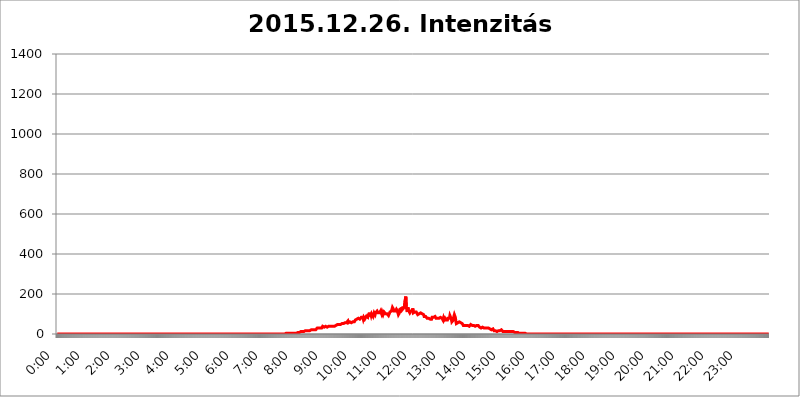
| Category | 2015.12.26. Intenzitás [W/m^2] |
|---|---|
| 0.0 | 0 |
| 0.0006944444444444445 | 0 |
| 0.001388888888888889 | 0 |
| 0.0020833333333333333 | 0 |
| 0.002777777777777778 | 0 |
| 0.003472222222222222 | 0 |
| 0.004166666666666667 | 0 |
| 0.004861111111111111 | 0 |
| 0.005555555555555556 | 0 |
| 0.0062499999999999995 | 0 |
| 0.006944444444444444 | 0 |
| 0.007638888888888889 | 0 |
| 0.008333333333333333 | 0 |
| 0.009027777777777779 | 0 |
| 0.009722222222222222 | 0 |
| 0.010416666666666666 | 0 |
| 0.011111111111111112 | 0 |
| 0.011805555555555555 | 0 |
| 0.012499999999999999 | 0 |
| 0.013194444444444444 | 0 |
| 0.013888888888888888 | 0 |
| 0.014583333333333332 | 0 |
| 0.015277777777777777 | 0 |
| 0.015972222222222224 | 0 |
| 0.016666666666666666 | 0 |
| 0.017361111111111112 | 0 |
| 0.018055555555555557 | 0 |
| 0.01875 | 0 |
| 0.019444444444444445 | 0 |
| 0.02013888888888889 | 0 |
| 0.020833333333333332 | 0 |
| 0.02152777777777778 | 0 |
| 0.022222222222222223 | 0 |
| 0.02291666666666667 | 0 |
| 0.02361111111111111 | 0 |
| 0.024305555555555556 | 0 |
| 0.024999999999999998 | 0 |
| 0.025694444444444447 | 0 |
| 0.02638888888888889 | 0 |
| 0.027083333333333334 | 0 |
| 0.027777777777777776 | 0 |
| 0.02847222222222222 | 0 |
| 0.029166666666666664 | 0 |
| 0.029861111111111113 | 0 |
| 0.030555555555555555 | 0 |
| 0.03125 | 0 |
| 0.03194444444444445 | 0 |
| 0.03263888888888889 | 0 |
| 0.03333333333333333 | 0 |
| 0.034027777777777775 | 0 |
| 0.034722222222222224 | 0 |
| 0.035416666666666666 | 0 |
| 0.036111111111111115 | 0 |
| 0.03680555555555556 | 0 |
| 0.0375 | 0 |
| 0.03819444444444444 | 0 |
| 0.03888888888888889 | 0 |
| 0.03958333333333333 | 0 |
| 0.04027777777777778 | 0 |
| 0.04097222222222222 | 0 |
| 0.041666666666666664 | 0 |
| 0.042361111111111106 | 0 |
| 0.04305555555555556 | 0 |
| 0.043750000000000004 | 0 |
| 0.044444444444444446 | 0 |
| 0.04513888888888889 | 0 |
| 0.04583333333333334 | 0 |
| 0.04652777777777778 | 0 |
| 0.04722222222222222 | 0 |
| 0.04791666666666666 | 0 |
| 0.04861111111111111 | 0 |
| 0.049305555555555554 | 0 |
| 0.049999999999999996 | 0 |
| 0.05069444444444445 | 0 |
| 0.051388888888888894 | 0 |
| 0.052083333333333336 | 0 |
| 0.05277777777777778 | 0 |
| 0.05347222222222222 | 0 |
| 0.05416666666666667 | 0 |
| 0.05486111111111111 | 0 |
| 0.05555555555555555 | 0 |
| 0.05625 | 0 |
| 0.05694444444444444 | 0 |
| 0.057638888888888885 | 0 |
| 0.05833333333333333 | 0 |
| 0.05902777777777778 | 0 |
| 0.059722222222222225 | 0 |
| 0.06041666666666667 | 0 |
| 0.061111111111111116 | 0 |
| 0.06180555555555556 | 0 |
| 0.0625 | 0 |
| 0.06319444444444444 | 0 |
| 0.06388888888888888 | 0 |
| 0.06458333333333334 | 0 |
| 0.06527777777777778 | 0 |
| 0.06597222222222222 | 0 |
| 0.06666666666666667 | 0 |
| 0.06736111111111111 | 0 |
| 0.06805555555555555 | 0 |
| 0.06874999999999999 | 0 |
| 0.06944444444444443 | 0 |
| 0.07013888888888889 | 0 |
| 0.07083333333333333 | 0 |
| 0.07152777777777779 | 0 |
| 0.07222222222222223 | 0 |
| 0.07291666666666667 | 0 |
| 0.07361111111111111 | 0 |
| 0.07430555555555556 | 0 |
| 0.075 | 0 |
| 0.07569444444444444 | 0 |
| 0.0763888888888889 | 0 |
| 0.07708333333333334 | 0 |
| 0.07777777777777778 | 0 |
| 0.07847222222222222 | 0 |
| 0.07916666666666666 | 0 |
| 0.0798611111111111 | 0 |
| 0.08055555555555556 | 0 |
| 0.08125 | 0 |
| 0.08194444444444444 | 0 |
| 0.08263888888888889 | 0 |
| 0.08333333333333333 | 0 |
| 0.08402777777777777 | 0 |
| 0.08472222222222221 | 0 |
| 0.08541666666666665 | 0 |
| 0.08611111111111112 | 0 |
| 0.08680555555555557 | 0 |
| 0.08750000000000001 | 0 |
| 0.08819444444444445 | 0 |
| 0.08888888888888889 | 0 |
| 0.08958333333333333 | 0 |
| 0.09027777777777778 | 0 |
| 0.09097222222222222 | 0 |
| 0.09166666666666667 | 0 |
| 0.09236111111111112 | 0 |
| 0.09305555555555556 | 0 |
| 0.09375 | 0 |
| 0.09444444444444444 | 0 |
| 0.09513888888888888 | 0 |
| 0.09583333333333333 | 0 |
| 0.09652777777777777 | 0 |
| 0.09722222222222222 | 0 |
| 0.09791666666666667 | 0 |
| 0.09861111111111111 | 0 |
| 0.09930555555555555 | 0 |
| 0.09999999999999999 | 0 |
| 0.10069444444444443 | 0 |
| 0.1013888888888889 | 0 |
| 0.10208333333333335 | 0 |
| 0.10277777777777779 | 0 |
| 0.10347222222222223 | 0 |
| 0.10416666666666667 | 0 |
| 0.10486111111111111 | 0 |
| 0.10555555555555556 | 0 |
| 0.10625 | 0 |
| 0.10694444444444444 | 0 |
| 0.1076388888888889 | 0 |
| 0.10833333333333334 | 0 |
| 0.10902777777777778 | 0 |
| 0.10972222222222222 | 0 |
| 0.1111111111111111 | 0 |
| 0.11180555555555556 | 0 |
| 0.11180555555555556 | 0 |
| 0.1125 | 0 |
| 0.11319444444444444 | 0 |
| 0.11388888888888889 | 0 |
| 0.11458333333333333 | 0 |
| 0.11527777777777777 | 0 |
| 0.11597222222222221 | 0 |
| 0.11666666666666665 | 0 |
| 0.1173611111111111 | 0 |
| 0.11805555555555557 | 0 |
| 0.11944444444444445 | 0 |
| 0.12013888888888889 | 0 |
| 0.12083333333333333 | 0 |
| 0.12152777777777778 | 0 |
| 0.12222222222222223 | 0 |
| 0.12291666666666667 | 0 |
| 0.12291666666666667 | 0 |
| 0.12361111111111112 | 0 |
| 0.12430555555555556 | 0 |
| 0.125 | 0 |
| 0.12569444444444444 | 0 |
| 0.12638888888888888 | 0 |
| 0.12708333333333333 | 0 |
| 0.16875 | 0 |
| 0.12847222222222224 | 0 |
| 0.12916666666666668 | 0 |
| 0.12986111111111112 | 0 |
| 0.13055555555555556 | 0 |
| 0.13125 | 0 |
| 0.13194444444444445 | 0 |
| 0.1326388888888889 | 0 |
| 0.13333333333333333 | 0 |
| 0.13402777777777777 | 0 |
| 0.13402777777777777 | 0 |
| 0.13472222222222222 | 0 |
| 0.13541666666666666 | 0 |
| 0.1361111111111111 | 0 |
| 0.13749999999999998 | 0 |
| 0.13819444444444443 | 0 |
| 0.1388888888888889 | 0 |
| 0.13958333333333334 | 0 |
| 0.14027777777777778 | 0 |
| 0.14097222222222222 | 0 |
| 0.14166666666666666 | 0 |
| 0.1423611111111111 | 0 |
| 0.14305555555555557 | 0 |
| 0.14375000000000002 | 0 |
| 0.14444444444444446 | 0 |
| 0.1451388888888889 | 0 |
| 0.1451388888888889 | 0 |
| 0.14652777777777778 | 0 |
| 0.14722222222222223 | 0 |
| 0.14791666666666667 | 0 |
| 0.1486111111111111 | 0 |
| 0.14930555555555555 | 0 |
| 0.15 | 0 |
| 0.15069444444444444 | 0 |
| 0.15138888888888888 | 0 |
| 0.15208333333333332 | 0 |
| 0.15277777777777776 | 0 |
| 0.15347222222222223 | 0 |
| 0.15416666666666667 | 0 |
| 0.15486111111111112 | 0 |
| 0.15555555555555556 | 0 |
| 0.15625 | 0 |
| 0.15694444444444444 | 0 |
| 0.15763888888888888 | 0 |
| 0.15833333333333333 | 0 |
| 0.15902777777777777 | 0 |
| 0.15972222222222224 | 0 |
| 0.16041666666666668 | 0 |
| 0.16111111111111112 | 0 |
| 0.16180555555555556 | 0 |
| 0.1625 | 0 |
| 0.16319444444444445 | 0 |
| 0.1638888888888889 | 0 |
| 0.16458333333333333 | 0 |
| 0.16527777777777777 | 0 |
| 0.16597222222222222 | 0 |
| 0.16666666666666666 | 0 |
| 0.1673611111111111 | 0 |
| 0.16805555555555554 | 0 |
| 0.16874999999999998 | 0 |
| 0.16944444444444443 | 0 |
| 0.17013888888888887 | 0 |
| 0.1708333333333333 | 0 |
| 0.17152777777777775 | 0 |
| 0.17222222222222225 | 0 |
| 0.1729166666666667 | 0 |
| 0.17361111111111113 | 0 |
| 0.17430555555555557 | 0 |
| 0.17500000000000002 | 0 |
| 0.17569444444444446 | 0 |
| 0.1763888888888889 | 0 |
| 0.17708333333333334 | 0 |
| 0.17777777777777778 | 0 |
| 0.17847222222222223 | 0 |
| 0.17916666666666667 | 0 |
| 0.1798611111111111 | 0 |
| 0.18055555555555555 | 0 |
| 0.18125 | 0 |
| 0.18194444444444444 | 0 |
| 0.1826388888888889 | 0 |
| 0.18333333333333335 | 0 |
| 0.1840277777777778 | 0 |
| 0.18472222222222223 | 0 |
| 0.18541666666666667 | 0 |
| 0.18611111111111112 | 0 |
| 0.18680555555555556 | 0 |
| 0.1875 | 0 |
| 0.18819444444444444 | 0 |
| 0.18888888888888888 | 0 |
| 0.18958333333333333 | 0 |
| 0.19027777777777777 | 0 |
| 0.1909722222222222 | 0 |
| 0.19166666666666665 | 0 |
| 0.19236111111111112 | 0 |
| 0.19305555555555554 | 0 |
| 0.19375 | 0 |
| 0.19444444444444445 | 0 |
| 0.1951388888888889 | 0 |
| 0.19583333333333333 | 0 |
| 0.19652777777777777 | 0 |
| 0.19722222222222222 | 0 |
| 0.19791666666666666 | 0 |
| 0.1986111111111111 | 0 |
| 0.19930555555555554 | 0 |
| 0.19999999999999998 | 0 |
| 0.20069444444444443 | 0 |
| 0.20138888888888887 | 0 |
| 0.2020833333333333 | 0 |
| 0.2027777777777778 | 0 |
| 0.2034722222222222 | 0 |
| 0.2041666666666667 | 0 |
| 0.20486111111111113 | 0 |
| 0.20555555555555557 | 0 |
| 0.20625000000000002 | 0 |
| 0.20694444444444446 | 0 |
| 0.2076388888888889 | 0 |
| 0.20833333333333334 | 0 |
| 0.20902777777777778 | 0 |
| 0.20972222222222223 | 0 |
| 0.21041666666666667 | 0 |
| 0.2111111111111111 | 0 |
| 0.21180555555555555 | 0 |
| 0.2125 | 0 |
| 0.21319444444444444 | 0 |
| 0.2138888888888889 | 0 |
| 0.21458333333333335 | 0 |
| 0.2152777777777778 | 0 |
| 0.21597222222222223 | 0 |
| 0.21666666666666667 | 0 |
| 0.21736111111111112 | 0 |
| 0.21805555555555556 | 0 |
| 0.21875 | 0 |
| 0.21944444444444444 | 0 |
| 0.22013888888888888 | 0 |
| 0.22083333333333333 | 0 |
| 0.22152777777777777 | 0 |
| 0.2222222222222222 | 0 |
| 0.22291666666666665 | 0 |
| 0.2236111111111111 | 0 |
| 0.22430555555555556 | 0 |
| 0.225 | 0 |
| 0.22569444444444445 | 0 |
| 0.2263888888888889 | 0 |
| 0.22708333333333333 | 0 |
| 0.22777777777777777 | 0 |
| 0.22847222222222222 | 0 |
| 0.22916666666666666 | 0 |
| 0.2298611111111111 | 0 |
| 0.23055555555555554 | 0 |
| 0.23124999999999998 | 0 |
| 0.23194444444444443 | 0 |
| 0.23263888888888887 | 0 |
| 0.2333333333333333 | 0 |
| 0.2340277777777778 | 0 |
| 0.2347222222222222 | 0 |
| 0.2354166666666667 | 0 |
| 0.23611111111111113 | 0 |
| 0.23680555555555557 | 0 |
| 0.23750000000000002 | 0 |
| 0.23819444444444446 | 0 |
| 0.2388888888888889 | 0 |
| 0.23958333333333334 | 0 |
| 0.24027777777777778 | 0 |
| 0.24097222222222223 | 0 |
| 0.24166666666666667 | 0 |
| 0.2423611111111111 | 0 |
| 0.24305555555555555 | 0 |
| 0.24375 | 0 |
| 0.24444444444444446 | 0 |
| 0.24513888888888888 | 0 |
| 0.24583333333333335 | 0 |
| 0.2465277777777778 | 0 |
| 0.24722222222222223 | 0 |
| 0.24791666666666667 | 0 |
| 0.24861111111111112 | 0 |
| 0.24930555555555556 | 0 |
| 0.25 | 0 |
| 0.25069444444444444 | 0 |
| 0.2513888888888889 | 0 |
| 0.2520833333333333 | 0 |
| 0.25277777777777777 | 0 |
| 0.2534722222222222 | 0 |
| 0.25416666666666665 | 0 |
| 0.2548611111111111 | 0 |
| 0.2555555555555556 | 0 |
| 0.25625000000000003 | 0 |
| 0.2569444444444445 | 0 |
| 0.2576388888888889 | 0 |
| 0.25833333333333336 | 0 |
| 0.2590277777777778 | 0 |
| 0.25972222222222224 | 0 |
| 0.2604166666666667 | 0 |
| 0.2611111111111111 | 0 |
| 0.26180555555555557 | 0 |
| 0.2625 | 0 |
| 0.26319444444444445 | 0 |
| 0.2638888888888889 | 0 |
| 0.26458333333333334 | 0 |
| 0.2652777777777778 | 0 |
| 0.2659722222222222 | 0 |
| 0.26666666666666666 | 0 |
| 0.2673611111111111 | 0 |
| 0.26805555555555555 | 0 |
| 0.26875 | 0 |
| 0.26944444444444443 | 0 |
| 0.2701388888888889 | 0 |
| 0.2708333333333333 | 0 |
| 0.27152777777777776 | 0 |
| 0.2722222222222222 | 0 |
| 0.27291666666666664 | 0 |
| 0.2736111111111111 | 0 |
| 0.2743055555555555 | 0 |
| 0.27499999999999997 | 0 |
| 0.27569444444444446 | 0 |
| 0.27638888888888885 | 0 |
| 0.27708333333333335 | 0 |
| 0.2777777777777778 | 0 |
| 0.27847222222222223 | 0 |
| 0.2791666666666667 | 0 |
| 0.2798611111111111 | 0 |
| 0.28055555555555556 | 0 |
| 0.28125 | 0 |
| 0.28194444444444444 | 0 |
| 0.2826388888888889 | 0 |
| 0.2833333333333333 | 0 |
| 0.28402777777777777 | 0 |
| 0.2847222222222222 | 0 |
| 0.28541666666666665 | 0 |
| 0.28611111111111115 | 0 |
| 0.28680555555555554 | 0 |
| 0.28750000000000003 | 0 |
| 0.2881944444444445 | 0 |
| 0.2888888888888889 | 0 |
| 0.28958333333333336 | 0 |
| 0.2902777777777778 | 0 |
| 0.29097222222222224 | 0 |
| 0.2916666666666667 | 0 |
| 0.2923611111111111 | 0 |
| 0.29305555555555557 | 0 |
| 0.29375 | 0 |
| 0.29444444444444445 | 0 |
| 0.2951388888888889 | 0 |
| 0.29583333333333334 | 0 |
| 0.2965277777777778 | 0 |
| 0.2972222222222222 | 0 |
| 0.29791666666666666 | 0 |
| 0.2986111111111111 | 0 |
| 0.29930555555555555 | 0 |
| 0.3 | 0 |
| 0.30069444444444443 | 0 |
| 0.3013888888888889 | 0 |
| 0.3020833333333333 | 0 |
| 0.30277777777777776 | 0 |
| 0.3034722222222222 | 0 |
| 0.30416666666666664 | 0 |
| 0.3048611111111111 | 0 |
| 0.3055555555555555 | 0 |
| 0.30624999999999997 | 0 |
| 0.3069444444444444 | 0 |
| 0.3076388888888889 | 0 |
| 0.30833333333333335 | 0 |
| 0.3090277777777778 | 0 |
| 0.30972222222222223 | 0 |
| 0.3104166666666667 | 0 |
| 0.3111111111111111 | 0 |
| 0.31180555555555556 | 0 |
| 0.3125 | 0 |
| 0.31319444444444444 | 0 |
| 0.3138888888888889 | 0 |
| 0.3145833333333333 | 0 |
| 0.31527777777777777 | 0 |
| 0.3159722222222222 | 0 |
| 0.31666666666666665 | 0 |
| 0.31736111111111115 | 0 |
| 0.31805555555555554 | 0 |
| 0.31875000000000003 | 0 |
| 0.3194444444444445 | 0 |
| 0.3201388888888889 | 0 |
| 0.32083333333333336 | 3.525 |
| 0.3215277777777778 | 0 |
| 0.32222222222222224 | 0 |
| 0.3229166666666667 | 3.525 |
| 0.3236111111111111 | 3.525 |
| 0.32430555555555557 | 3.525 |
| 0.325 | 3.525 |
| 0.32569444444444445 | 3.525 |
| 0.3263888888888889 | 3.525 |
| 0.32708333333333334 | 3.525 |
| 0.3277777777777778 | 3.525 |
| 0.3284722222222222 | 3.525 |
| 0.32916666666666666 | 3.525 |
| 0.3298611111111111 | 3.525 |
| 0.33055555555555555 | 3.525 |
| 0.33125 | 3.525 |
| 0.33194444444444443 | 3.525 |
| 0.3326388888888889 | 3.525 |
| 0.3333333333333333 | 3.525 |
| 0.3340277777777778 | 3.525 |
| 0.3347222222222222 | 3.525 |
| 0.3354166666666667 | 3.525 |
| 0.3361111111111111 | 3.525 |
| 0.3368055555555556 | 7.887 |
| 0.33749999999999997 | 7.887 |
| 0.33819444444444446 | 7.887 |
| 0.33888888888888885 | 7.887 |
| 0.33958333333333335 | 7.887 |
| 0.34027777777777773 | 7.887 |
| 0.34097222222222223 | 12.257 |
| 0.3416666666666666 | 12.257 |
| 0.3423611111111111 | 12.257 |
| 0.3430555555555555 | 12.257 |
| 0.34375 | 12.257 |
| 0.3444444444444445 | 12.257 |
| 0.3451388888888889 | 12.257 |
| 0.3458333333333334 | 12.257 |
| 0.34652777777777777 | 16.636 |
| 0.34722222222222227 | 16.636 |
| 0.34791666666666665 | 16.636 |
| 0.34861111111111115 | 12.257 |
| 0.34930555555555554 | 16.636 |
| 0.35000000000000003 | 16.636 |
| 0.3506944444444444 | 16.636 |
| 0.3513888888888889 | 16.636 |
| 0.3520833333333333 | 16.636 |
| 0.3527777777777778 | 16.636 |
| 0.3534722222222222 | 16.636 |
| 0.3541666666666667 | 16.636 |
| 0.3548611111111111 | 16.636 |
| 0.35555555555555557 | 21.024 |
| 0.35625 | 21.024 |
| 0.35694444444444445 | 21.024 |
| 0.3576388888888889 | 21.024 |
| 0.35833333333333334 | 21.024 |
| 0.3590277777777778 | 21.024 |
| 0.3597222222222222 | 21.024 |
| 0.36041666666666666 | 21.024 |
| 0.3611111111111111 | 21.024 |
| 0.36180555555555555 | 21.024 |
| 0.3625 | 21.024 |
| 0.36319444444444443 | 25.419 |
| 0.3638888888888889 | 25.419 |
| 0.3645833333333333 | 29.823 |
| 0.3652777777777778 | 29.823 |
| 0.3659722222222222 | 29.823 |
| 0.3666666666666667 | 29.823 |
| 0.3673611111111111 | 29.823 |
| 0.3680555555555556 | 29.823 |
| 0.36874999999999997 | 29.823 |
| 0.36944444444444446 | 29.823 |
| 0.37013888888888885 | 34.234 |
| 0.37083333333333335 | 29.823 |
| 0.37152777777777773 | 34.234 |
| 0.37222222222222223 | 38.653 |
| 0.3729166666666666 | 34.234 |
| 0.3736111111111111 | 34.234 |
| 0.3743055555555555 | 34.234 |
| 0.375 | 34.234 |
| 0.3756944444444445 | 38.653 |
| 0.3763888888888889 | 38.653 |
| 0.3770833333333334 | 34.234 |
| 0.37777777777777777 | 34.234 |
| 0.37847222222222227 | 34.234 |
| 0.37916666666666665 | 34.234 |
| 0.37986111111111115 | 38.653 |
| 0.38055555555555554 | 38.653 |
| 0.38125000000000003 | 43.079 |
| 0.3819444444444444 | 38.653 |
| 0.3826388888888889 | 38.653 |
| 0.3833333333333333 | 38.653 |
| 0.3840277777777778 | 38.653 |
| 0.3847222222222222 | 38.653 |
| 0.3854166666666667 | 38.653 |
| 0.3861111111111111 | 38.653 |
| 0.38680555555555557 | 38.653 |
| 0.3875 | 38.653 |
| 0.38819444444444445 | 38.653 |
| 0.3888888888888889 | 38.653 |
| 0.38958333333333334 | 38.653 |
| 0.3902777777777778 | 38.653 |
| 0.3909722222222222 | 43.079 |
| 0.39166666666666666 | 43.079 |
| 0.3923611111111111 | 47.511 |
| 0.39305555555555555 | 47.511 |
| 0.39375 | 47.511 |
| 0.39444444444444443 | 47.511 |
| 0.3951388888888889 | 47.511 |
| 0.3958333333333333 | 47.511 |
| 0.3965277777777778 | 51.951 |
| 0.3972222222222222 | 47.511 |
| 0.3979166666666667 | 47.511 |
| 0.3986111111111111 | 51.951 |
| 0.3993055555555556 | 51.951 |
| 0.39999999999999997 | 47.511 |
| 0.40069444444444446 | 47.511 |
| 0.40138888888888885 | 51.951 |
| 0.40208333333333335 | 56.398 |
| 0.40277777777777773 | 56.398 |
| 0.40347222222222223 | 56.398 |
| 0.4041666666666666 | 56.398 |
| 0.4048611111111111 | 56.398 |
| 0.4055555555555555 | 56.398 |
| 0.40625 | 56.398 |
| 0.4069444444444445 | 51.951 |
| 0.4076388888888889 | 65.31 |
| 0.4083333333333334 | 56.398 |
| 0.40902777777777777 | 56.398 |
| 0.40972222222222227 | 56.398 |
| 0.41041666666666665 | 60.85 |
| 0.41111111111111115 | 56.398 |
| 0.41180555555555554 | 56.398 |
| 0.41250000000000003 | 56.398 |
| 0.4131944444444444 | 60.85 |
| 0.4138888888888889 | 60.85 |
| 0.4145833333333333 | 60.85 |
| 0.4152777777777778 | 60.85 |
| 0.4159722222222222 | 60.85 |
| 0.4166666666666667 | 60.85 |
| 0.4173611111111111 | 65.31 |
| 0.41805555555555557 | 69.775 |
| 0.41875 | 69.775 |
| 0.41944444444444445 | 74.246 |
| 0.4201388888888889 | 74.246 |
| 0.42083333333333334 | 74.246 |
| 0.4215277777777778 | 74.246 |
| 0.4222222222222222 | 78.722 |
| 0.42291666666666666 | 74.246 |
| 0.4236111111111111 | 78.722 |
| 0.42430555555555555 | 74.246 |
| 0.425 | 74.246 |
| 0.42569444444444443 | 78.722 |
| 0.4263888888888889 | 83.205 |
| 0.4270833333333333 | 83.205 |
| 0.4277777777777778 | 78.722 |
| 0.4284722222222222 | 83.205 |
| 0.4291666666666667 | 74.246 |
| 0.4298611111111111 | 83.205 |
| 0.4305555555555556 | 78.722 |
| 0.43124999999999997 | 74.246 |
| 0.43194444444444446 | 78.722 |
| 0.43263888888888885 | 78.722 |
| 0.43333333333333335 | 87.692 |
| 0.43402777777777773 | 83.205 |
| 0.43472222222222223 | 87.692 |
| 0.4354166666666666 | 83.205 |
| 0.4361111111111111 | 101.184 |
| 0.4368055555555555 | 87.692 |
| 0.4375 | 101.184 |
| 0.4381944444444445 | 101.184 |
| 0.4388888888888889 | 101.184 |
| 0.4395833333333334 | 101.184 |
| 0.44027777777777777 | 92.184 |
| 0.44097222222222227 | 101.184 |
| 0.44166666666666665 | 96.682 |
| 0.44236111111111115 | 92.184 |
| 0.44305555555555554 | 105.69 |
| 0.44375000000000003 | 96.682 |
| 0.4444444444444444 | 105.69 |
| 0.4451388888888889 | 101.184 |
| 0.4458333333333333 | 96.682 |
| 0.4465277777777778 | 105.69 |
| 0.4472222222222222 | 101.184 |
| 0.4479166666666667 | 110.201 |
| 0.4486111111111111 | 114.716 |
| 0.44930555555555557 | 110.201 |
| 0.45 | 105.69 |
| 0.45069444444444445 | 110.201 |
| 0.4513888888888889 | 105.69 |
| 0.45208333333333334 | 105.69 |
| 0.4527777777777778 | 101.184 |
| 0.4534722222222222 | 114.716 |
| 0.45416666666666666 | 110.201 |
| 0.4548611111111111 | 101.184 |
| 0.45555555555555555 | 110.201 |
| 0.45625 | 105.69 |
| 0.45694444444444443 | 96.682 |
| 0.4576388888888889 | 101.184 |
| 0.4583333333333333 | 110.201 |
| 0.4590277777777778 | 110.201 |
| 0.4597222222222222 | 110.201 |
| 0.4604166666666667 | 101.184 |
| 0.4611111111111111 | 96.682 |
| 0.4618055555555556 | 96.682 |
| 0.46249999999999997 | 101.184 |
| 0.46319444444444446 | 101.184 |
| 0.46388888888888885 | 96.682 |
| 0.46458333333333335 | 92.184 |
| 0.46527777777777773 | 92.184 |
| 0.46597222222222223 | 96.682 |
| 0.4666666666666666 | 110.201 |
| 0.4673611111111111 | 110.201 |
| 0.4680555555555555 | 114.716 |
| 0.46875 | 114.716 |
| 0.4694444444444445 | 119.235 |
| 0.4701388888888889 | 132.814 |
| 0.4708333333333334 | 132.814 |
| 0.47152777777777777 | 123.758 |
| 0.47222222222222227 | 114.716 |
| 0.47291666666666665 | 110.201 |
| 0.47361111111111115 | 110.201 |
| 0.47430555555555554 | 114.716 |
| 0.47500000000000003 | 114.716 |
| 0.4756944444444444 | 123.758 |
| 0.4763888888888889 | 119.235 |
| 0.4770833333333333 | 114.716 |
| 0.4777777777777778 | 105.69 |
| 0.4784722222222222 | 96.682 |
| 0.4791666666666667 | 101.184 |
| 0.4798611111111111 | 105.69 |
| 0.48055555555555557 | 123.758 |
| 0.48125 | 119.235 |
| 0.48194444444444445 | 119.235 |
| 0.4826388888888889 | 128.284 |
| 0.48333333333333334 | 119.235 |
| 0.4840277777777778 | 123.758 |
| 0.4847222222222222 | 119.235 |
| 0.48541666666666666 | 128.284 |
| 0.4861111111111111 | 132.814 |
| 0.48680555555555555 | 137.347 |
| 0.4875 | 164.605 |
| 0.48819444444444443 | 173.709 |
| 0.4888888888888889 | 187.378 |
| 0.4895833333333333 | 137.347 |
| 0.4902777777777778 | 119.235 |
| 0.4909722222222222 | 110.201 |
| 0.4916666666666667 | 132.814 |
| 0.4923611111111111 | 123.758 |
| 0.4930555555555556 | 114.716 |
| 0.49374999999999997 | 110.201 |
| 0.49444444444444446 | 105.69 |
| 0.49513888888888885 | 105.69 |
| 0.49583333333333335 | 114.716 |
| 0.49652777777777773 | 119.235 |
| 0.49722222222222223 | 114.716 |
| 0.4979166666666666 | 114.716 |
| 0.4986111111111111 | 128.284 |
| 0.4993055555555555 | 105.69 |
| 0.5 | 110.201 |
| 0.5006944444444444 | 110.201 |
| 0.5013888888888889 | 110.201 |
| 0.5020833333333333 | 114.716 |
| 0.5027777777777778 | 114.716 |
| 0.5034722222222222 | 110.201 |
| 0.5041666666666667 | 110.201 |
| 0.5048611111111111 | 105.69 |
| 0.5055555555555555 | 96.682 |
| 0.50625 | 96.682 |
| 0.5069444444444444 | 101.184 |
| 0.5076388888888889 | 101.184 |
| 0.5083333333333333 | 105.69 |
| 0.5090277777777777 | 105.69 |
| 0.5097222222222222 | 105.69 |
| 0.5104166666666666 | 110.201 |
| 0.5111111111111112 | 110.201 |
| 0.5118055555555555 | 101.184 |
| 0.5125000000000001 | 101.184 |
| 0.5131944444444444 | 101.184 |
| 0.513888888888889 | 96.682 |
| 0.5145833333333333 | 87.692 |
| 0.5152777777777778 | 83.205 |
| 0.5159722222222222 | 87.692 |
| 0.5166666666666667 | 87.692 |
| 0.517361111111111 | 87.692 |
| 0.5180555555555556 | 83.205 |
| 0.5187499999999999 | 78.722 |
| 0.5194444444444445 | 74.246 |
| 0.5201388888888888 | 83.205 |
| 0.5208333333333334 | 78.722 |
| 0.5215277777777778 | 78.722 |
| 0.5222222222222223 | 78.722 |
| 0.5229166666666667 | 74.246 |
| 0.5236111111111111 | 74.246 |
| 0.5243055555555556 | 69.775 |
| 0.525 | 74.246 |
| 0.5256944444444445 | 83.205 |
| 0.5263888888888889 | 83.205 |
| 0.5270833333333333 | 83.205 |
| 0.5277777777777778 | 83.205 |
| 0.5284722222222222 | 87.692 |
| 0.5291666666666667 | 87.692 |
| 0.5298611111111111 | 87.692 |
| 0.5305555555555556 | 87.692 |
| 0.53125 | 78.722 |
| 0.5319444444444444 | 74.246 |
| 0.5326388888888889 | 74.246 |
| 0.5333333333333333 | 78.722 |
| 0.5340277777777778 | 78.722 |
| 0.5347222222222222 | 74.246 |
| 0.5354166666666667 | 78.722 |
| 0.5361111111111111 | 83.205 |
| 0.5368055555555555 | 83.205 |
| 0.5375 | 83.205 |
| 0.5381944444444444 | 87.692 |
| 0.5388888888888889 | 87.692 |
| 0.5395833333333333 | 78.722 |
| 0.5402777777777777 | 74.246 |
| 0.5409722222222222 | 69.775 |
| 0.5416666666666666 | 78.722 |
| 0.5423611111111112 | 69.775 |
| 0.5430555555555555 | 74.246 |
| 0.5437500000000001 | 78.722 |
| 0.5444444444444444 | 74.246 |
| 0.545138888888889 | 69.775 |
| 0.5458333333333333 | 69.775 |
| 0.5465277777777778 | 65.31 |
| 0.5472222222222222 | 69.775 |
| 0.5479166666666667 | 78.722 |
| 0.548611111111111 | 83.205 |
| 0.5493055555555556 | 74.246 |
| 0.5499999999999999 | 78.722 |
| 0.5506944444444445 | 92.184 |
| 0.5513888888888888 | 92.184 |
| 0.5520833333333334 | 87.692 |
| 0.5527777777777778 | 74.246 |
| 0.5534722222222223 | 60.85 |
| 0.5541666666666667 | 56.398 |
| 0.5548611111111111 | 56.398 |
| 0.5555555555555556 | 69.775 |
| 0.55625 | 87.692 |
| 0.5569444444444445 | 96.682 |
| 0.5576388888888889 | 96.682 |
| 0.5583333333333333 | 83.205 |
| 0.5590277777777778 | 65.31 |
| 0.5597222222222222 | 51.951 |
| 0.5604166666666667 | 47.511 |
| 0.5611111111111111 | 56.398 |
| 0.5618055555555556 | 56.398 |
| 0.5625 | 56.398 |
| 0.5631944444444444 | 60.85 |
| 0.5638888888888889 | 60.85 |
| 0.5645833333333333 | 56.398 |
| 0.5652777777777778 | 60.85 |
| 0.5659722222222222 | 56.398 |
| 0.5666666666666667 | 51.951 |
| 0.5673611111111111 | 51.951 |
| 0.5680555555555555 | 51.951 |
| 0.56875 | 47.511 |
| 0.5694444444444444 | 43.079 |
| 0.5701388888888889 | 43.079 |
| 0.5708333333333333 | 43.079 |
| 0.5715277777777777 | 43.079 |
| 0.5722222222222222 | 43.079 |
| 0.5729166666666666 | 43.079 |
| 0.5736111111111112 | 43.079 |
| 0.5743055555555555 | 43.079 |
| 0.5750000000000001 | 43.079 |
| 0.5756944444444444 | 43.079 |
| 0.576388888888889 | 43.079 |
| 0.5770833333333333 | 43.079 |
| 0.5777777777777778 | 38.653 |
| 0.5784722222222222 | 38.653 |
| 0.5791666666666667 | 43.079 |
| 0.579861111111111 | 47.511 |
| 0.5805555555555556 | 43.079 |
| 0.5812499999999999 | 43.079 |
| 0.5819444444444445 | 43.079 |
| 0.5826388888888888 | 43.079 |
| 0.5833333333333334 | 38.653 |
| 0.5840277777777778 | 43.079 |
| 0.5847222222222223 | 38.653 |
| 0.5854166666666667 | 38.653 |
| 0.5861111111111111 | 38.653 |
| 0.5868055555555556 | 43.079 |
| 0.5875 | 43.079 |
| 0.5881944444444445 | 43.079 |
| 0.5888888888888889 | 38.653 |
| 0.5895833333333333 | 38.653 |
| 0.5902777777777778 | 43.079 |
| 0.5909722222222222 | 47.511 |
| 0.5916666666666667 | 43.079 |
| 0.5923611111111111 | 34.234 |
| 0.5930555555555556 | 34.234 |
| 0.59375 | 29.823 |
| 0.5944444444444444 | 29.823 |
| 0.5951388888888889 | 29.823 |
| 0.5958333333333333 | 29.823 |
| 0.5965277777777778 | 34.234 |
| 0.5972222222222222 | 34.234 |
| 0.5979166666666667 | 34.234 |
| 0.5986111111111111 | 29.823 |
| 0.5993055555555555 | 29.823 |
| 0.6 | 29.823 |
| 0.6006944444444444 | 29.823 |
| 0.6013888888888889 | 25.419 |
| 0.6020833333333333 | 29.823 |
| 0.6027777777777777 | 29.823 |
| 0.6034722222222222 | 29.823 |
| 0.6041666666666666 | 29.823 |
| 0.6048611111111112 | 29.823 |
| 0.6055555555555555 | 29.823 |
| 0.6062500000000001 | 25.419 |
| 0.6069444444444444 | 25.419 |
| 0.607638888888889 | 25.419 |
| 0.6083333333333333 | 21.024 |
| 0.6090277777777778 | 21.024 |
| 0.6097222222222222 | 25.419 |
| 0.6104166666666667 | 25.419 |
| 0.611111111111111 | 25.419 |
| 0.6118055555555556 | 21.024 |
| 0.6124999999999999 | 16.636 |
| 0.6131944444444445 | 16.636 |
| 0.6138888888888888 | 16.636 |
| 0.6145833333333334 | 16.636 |
| 0.6152777777777778 | 12.257 |
| 0.6159722222222223 | 16.636 |
| 0.6166666666666667 | 12.257 |
| 0.6173611111111111 | 16.636 |
| 0.6180555555555556 | 16.636 |
| 0.61875 | 16.636 |
| 0.6194444444444445 | 16.636 |
| 0.6201388888888889 | 16.636 |
| 0.6208333333333333 | 16.636 |
| 0.6215277777777778 | 21.024 |
| 0.6222222222222222 | 21.024 |
| 0.6229166666666667 | 21.024 |
| 0.6236111111111111 | 16.636 |
| 0.6243055555555556 | 16.636 |
| 0.625 | 12.257 |
| 0.6256944444444444 | 12.257 |
| 0.6263888888888889 | 12.257 |
| 0.6270833333333333 | 12.257 |
| 0.6277777777777778 | 12.257 |
| 0.6284722222222222 | 7.887 |
| 0.6291666666666667 | 12.257 |
| 0.6298611111111111 | 12.257 |
| 0.6305555555555555 | 12.257 |
| 0.63125 | 12.257 |
| 0.6319444444444444 | 12.257 |
| 0.6326388888888889 | 12.257 |
| 0.6333333333333333 | 12.257 |
| 0.6340277777777777 | 7.887 |
| 0.6347222222222222 | 7.887 |
| 0.6354166666666666 | 12.257 |
| 0.6361111111111112 | 12.257 |
| 0.6368055555555555 | 7.887 |
| 0.6375000000000001 | 12.257 |
| 0.6381944444444444 | 12.257 |
| 0.638888888888889 | 12.257 |
| 0.6395833333333333 | 12.257 |
| 0.6402777777777778 | 12.257 |
| 0.6409722222222222 | 7.887 |
| 0.6416666666666667 | 7.887 |
| 0.642361111111111 | 7.887 |
| 0.6430555555555556 | 12.257 |
| 0.6437499999999999 | 7.887 |
| 0.6444444444444445 | 7.887 |
| 0.6451388888888888 | 7.887 |
| 0.6458333333333334 | 7.887 |
| 0.6465277777777778 | 7.887 |
| 0.6472222222222223 | 7.887 |
| 0.6479166666666667 | 3.525 |
| 0.6486111111111111 | 3.525 |
| 0.6493055555555556 | 3.525 |
| 0.65 | 3.525 |
| 0.6506944444444445 | 3.525 |
| 0.6513888888888889 | 3.525 |
| 0.6520833333333333 | 3.525 |
| 0.6527777777777778 | 3.525 |
| 0.6534722222222222 | 3.525 |
| 0.6541666666666667 | 3.525 |
| 0.6548611111111111 | 3.525 |
| 0.6555555555555556 | 3.525 |
| 0.65625 | 3.525 |
| 0.6569444444444444 | 0 |
| 0.6576388888888889 | 0 |
| 0.6583333333333333 | 0 |
| 0.6590277777777778 | 0 |
| 0.6597222222222222 | 0 |
| 0.6604166666666667 | 0 |
| 0.6611111111111111 | 0 |
| 0.6618055555555555 | 0 |
| 0.6625 | 0 |
| 0.6631944444444444 | 0 |
| 0.6638888888888889 | 0 |
| 0.6645833333333333 | 0 |
| 0.6652777777777777 | 0 |
| 0.6659722222222222 | 0 |
| 0.6666666666666666 | 0 |
| 0.6673611111111111 | 0 |
| 0.6680555555555556 | 0 |
| 0.6687500000000001 | 0 |
| 0.6694444444444444 | 0 |
| 0.6701388888888888 | 0 |
| 0.6708333333333334 | 0 |
| 0.6715277777777778 | 0 |
| 0.6722222222222222 | 0 |
| 0.6729166666666666 | 0 |
| 0.6736111111111112 | 0 |
| 0.6743055555555556 | 0 |
| 0.6749999999999999 | 0 |
| 0.6756944444444444 | 0 |
| 0.6763888888888889 | 0 |
| 0.6770833333333334 | 0 |
| 0.6777777777777777 | 0 |
| 0.6784722222222223 | 0 |
| 0.6791666666666667 | 0 |
| 0.6798611111111111 | 0 |
| 0.6805555555555555 | 0 |
| 0.68125 | 0 |
| 0.6819444444444445 | 0 |
| 0.6826388888888889 | 0 |
| 0.6833333333333332 | 0 |
| 0.6840277777777778 | 0 |
| 0.6847222222222222 | 0 |
| 0.6854166666666667 | 0 |
| 0.686111111111111 | 0 |
| 0.6868055555555556 | 0 |
| 0.6875 | 0 |
| 0.6881944444444444 | 0 |
| 0.688888888888889 | 0 |
| 0.6895833333333333 | 0 |
| 0.6902777777777778 | 0 |
| 0.6909722222222222 | 0 |
| 0.6916666666666668 | 0 |
| 0.6923611111111111 | 0 |
| 0.6930555555555555 | 0 |
| 0.69375 | 0 |
| 0.6944444444444445 | 0 |
| 0.6951388888888889 | 0 |
| 0.6958333333333333 | 0 |
| 0.6965277777777777 | 0 |
| 0.6972222222222223 | 0 |
| 0.6979166666666666 | 0 |
| 0.6986111111111111 | 0 |
| 0.6993055555555556 | 0 |
| 0.7000000000000001 | 0 |
| 0.7006944444444444 | 0 |
| 0.7013888888888888 | 0 |
| 0.7020833333333334 | 0 |
| 0.7027777777777778 | 0 |
| 0.7034722222222222 | 0 |
| 0.7041666666666666 | 0 |
| 0.7048611111111112 | 0 |
| 0.7055555555555556 | 0 |
| 0.7062499999999999 | 0 |
| 0.7069444444444444 | 0 |
| 0.7076388888888889 | 0 |
| 0.7083333333333334 | 0 |
| 0.7090277777777777 | 0 |
| 0.7097222222222223 | 0 |
| 0.7104166666666667 | 0 |
| 0.7111111111111111 | 0 |
| 0.7118055555555555 | 0 |
| 0.7125 | 0 |
| 0.7131944444444445 | 0 |
| 0.7138888888888889 | 0 |
| 0.7145833333333332 | 0 |
| 0.7152777777777778 | 0 |
| 0.7159722222222222 | 0 |
| 0.7166666666666667 | 0 |
| 0.717361111111111 | 0 |
| 0.7180555555555556 | 0 |
| 0.71875 | 0 |
| 0.7194444444444444 | 0 |
| 0.720138888888889 | 0 |
| 0.7208333333333333 | 0 |
| 0.7215277777777778 | 0 |
| 0.7222222222222222 | 0 |
| 0.7229166666666668 | 0 |
| 0.7236111111111111 | 0 |
| 0.7243055555555555 | 0 |
| 0.725 | 0 |
| 0.7256944444444445 | 0 |
| 0.7263888888888889 | 0 |
| 0.7270833333333333 | 0 |
| 0.7277777777777777 | 0 |
| 0.7284722222222223 | 0 |
| 0.7291666666666666 | 0 |
| 0.7298611111111111 | 0 |
| 0.7305555555555556 | 0 |
| 0.7312500000000001 | 0 |
| 0.7319444444444444 | 0 |
| 0.7326388888888888 | 0 |
| 0.7333333333333334 | 0 |
| 0.7340277777777778 | 0 |
| 0.7347222222222222 | 0 |
| 0.7354166666666666 | 0 |
| 0.7361111111111112 | 0 |
| 0.7368055555555556 | 0 |
| 0.7374999999999999 | 0 |
| 0.7381944444444444 | 0 |
| 0.7388888888888889 | 0 |
| 0.7395833333333334 | 0 |
| 0.7402777777777777 | 0 |
| 0.7409722222222223 | 0 |
| 0.7416666666666667 | 0 |
| 0.7423611111111111 | 0 |
| 0.7430555555555555 | 0 |
| 0.74375 | 0 |
| 0.7444444444444445 | 0 |
| 0.7451388888888889 | 0 |
| 0.7458333333333332 | 0 |
| 0.7465277777777778 | 0 |
| 0.7472222222222222 | 0 |
| 0.7479166666666667 | 0 |
| 0.748611111111111 | 0 |
| 0.7493055555555556 | 0 |
| 0.75 | 0 |
| 0.7506944444444444 | 0 |
| 0.751388888888889 | 0 |
| 0.7520833333333333 | 0 |
| 0.7527777777777778 | 0 |
| 0.7534722222222222 | 0 |
| 0.7541666666666668 | 0 |
| 0.7548611111111111 | 0 |
| 0.7555555555555555 | 0 |
| 0.75625 | 0 |
| 0.7569444444444445 | 0 |
| 0.7576388888888889 | 0 |
| 0.7583333333333333 | 0 |
| 0.7590277777777777 | 0 |
| 0.7597222222222223 | 0 |
| 0.7604166666666666 | 0 |
| 0.7611111111111111 | 0 |
| 0.7618055555555556 | 0 |
| 0.7625000000000001 | 0 |
| 0.7631944444444444 | 0 |
| 0.7638888888888888 | 0 |
| 0.7645833333333334 | 0 |
| 0.7652777777777778 | 0 |
| 0.7659722222222222 | 0 |
| 0.7666666666666666 | 0 |
| 0.7673611111111112 | 0 |
| 0.7680555555555556 | 0 |
| 0.7687499999999999 | 0 |
| 0.7694444444444444 | 0 |
| 0.7701388888888889 | 0 |
| 0.7708333333333334 | 0 |
| 0.7715277777777777 | 0 |
| 0.7722222222222223 | 0 |
| 0.7729166666666667 | 0 |
| 0.7736111111111111 | 0 |
| 0.7743055555555555 | 0 |
| 0.775 | 0 |
| 0.7756944444444445 | 0 |
| 0.7763888888888889 | 0 |
| 0.7770833333333332 | 0 |
| 0.7777777777777778 | 0 |
| 0.7784722222222222 | 0 |
| 0.7791666666666667 | 0 |
| 0.779861111111111 | 0 |
| 0.7805555555555556 | 0 |
| 0.78125 | 0 |
| 0.7819444444444444 | 0 |
| 0.782638888888889 | 0 |
| 0.7833333333333333 | 0 |
| 0.7840277777777778 | 0 |
| 0.7847222222222222 | 0 |
| 0.7854166666666668 | 0 |
| 0.7861111111111111 | 0 |
| 0.7868055555555555 | 0 |
| 0.7875 | 0 |
| 0.7881944444444445 | 0 |
| 0.7888888888888889 | 0 |
| 0.7895833333333333 | 0 |
| 0.7902777777777777 | 0 |
| 0.7909722222222223 | 0 |
| 0.7916666666666666 | 0 |
| 0.7923611111111111 | 0 |
| 0.7930555555555556 | 0 |
| 0.7937500000000001 | 0 |
| 0.7944444444444444 | 0 |
| 0.7951388888888888 | 0 |
| 0.7958333333333334 | 0 |
| 0.7965277777777778 | 0 |
| 0.7972222222222222 | 0 |
| 0.7979166666666666 | 0 |
| 0.7986111111111112 | 0 |
| 0.7993055555555556 | 0 |
| 0.7999999999999999 | 0 |
| 0.8006944444444444 | 0 |
| 0.8013888888888889 | 0 |
| 0.8020833333333334 | 0 |
| 0.8027777777777777 | 0 |
| 0.8034722222222223 | 0 |
| 0.8041666666666667 | 0 |
| 0.8048611111111111 | 0 |
| 0.8055555555555555 | 0 |
| 0.80625 | 0 |
| 0.8069444444444445 | 0 |
| 0.8076388888888889 | 0 |
| 0.8083333333333332 | 0 |
| 0.8090277777777778 | 0 |
| 0.8097222222222222 | 0 |
| 0.8104166666666667 | 0 |
| 0.811111111111111 | 0 |
| 0.8118055555555556 | 0 |
| 0.8125 | 0 |
| 0.8131944444444444 | 0 |
| 0.813888888888889 | 0 |
| 0.8145833333333333 | 0 |
| 0.8152777777777778 | 0 |
| 0.8159722222222222 | 0 |
| 0.8166666666666668 | 0 |
| 0.8173611111111111 | 0 |
| 0.8180555555555555 | 0 |
| 0.81875 | 0 |
| 0.8194444444444445 | 0 |
| 0.8201388888888889 | 0 |
| 0.8208333333333333 | 0 |
| 0.8215277777777777 | 0 |
| 0.8222222222222223 | 0 |
| 0.8229166666666666 | 0 |
| 0.8236111111111111 | 0 |
| 0.8243055555555556 | 0 |
| 0.8250000000000001 | 0 |
| 0.8256944444444444 | 0 |
| 0.8263888888888888 | 0 |
| 0.8270833333333334 | 0 |
| 0.8277777777777778 | 0 |
| 0.8284722222222222 | 0 |
| 0.8291666666666666 | 0 |
| 0.8298611111111112 | 0 |
| 0.8305555555555556 | 0 |
| 0.8312499999999999 | 0 |
| 0.8319444444444444 | 0 |
| 0.8326388888888889 | 0 |
| 0.8333333333333334 | 0 |
| 0.8340277777777777 | 0 |
| 0.8347222222222223 | 0 |
| 0.8354166666666667 | 0 |
| 0.8361111111111111 | 0 |
| 0.8368055555555555 | 0 |
| 0.8375 | 0 |
| 0.8381944444444445 | 0 |
| 0.8388888888888889 | 0 |
| 0.8395833333333332 | 0 |
| 0.8402777777777778 | 0 |
| 0.8409722222222222 | 0 |
| 0.8416666666666667 | 0 |
| 0.842361111111111 | 0 |
| 0.8430555555555556 | 0 |
| 0.84375 | 0 |
| 0.8444444444444444 | 0 |
| 0.845138888888889 | 0 |
| 0.8458333333333333 | 0 |
| 0.8465277777777778 | 0 |
| 0.8472222222222222 | 0 |
| 0.8479166666666668 | 0 |
| 0.8486111111111111 | 0 |
| 0.8493055555555555 | 0 |
| 0.85 | 0 |
| 0.8506944444444445 | 0 |
| 0.8513888888888889 | 0 |
| 0.8520833333333333 | 0 |
| 0.8527777777777777 | 0 |
| 0.8534722222222223 | 0 |
| 0.8541666666666666 | 0 |
| 0.8548611111111111 | 0 |
| 0.8555555555555556 | 0 |
| 0.8562500000000001 | 0 |
| 0.8569444444444444 | 0 |
| 0.8576388888888888 | 0 |
| 0.8583333333333334 | 0 |
| 0.8590277777777778 | 0 |
| 0.8597222222222222 | 0 |
| 0.8604166666666666 | 0 |
| 0.8611111111111112 | 0 |
| 0.8618055555555556 | 0 |
| 0.8624999999999999 | 0 |
| 0.8631944444444444 | 0 |
| 0.8638888888888889 | 0 |
| 0.8645833333333334 | 0 |
| 0.8652777777777777 | 0 |
| 0.8659722222222223 | 0 |
| 0.8666666666666667 | 0 |
| 0.8673611111111111 | 0 |
| 0.8680555555555555 | 0 |
| 0.86875 | 0 |
| 0.8694444444444445 | 0 |
| 0.8701388888888889 | 0 |
| 0.8708333333333332 | 0 |
| 0.8715277777777778 | 0 |
| 0.8722222222222222 | 0 |
| 0.8729166666666667 | 0 |
| 0.873611111111111 | 0 |
| 0.8743055555555556 | 0 |
| 0.875 | 0 |
| 0.8756944444444444 | 0 |
| 0.876388888888889 | 0 |
| 0.8770833333333333 | 0 |
| 0.8777777777777778 | 0 |
| 0.8784722222222222 | 0 |
| 0.8791666666666668 | 0 |
| 0.8798611111111111 | 0 |
| 0.8805555555555555 | 0 |
| 0.88125 | 0 |
| 0.8819444444444445 | 0 |
| 0.8826388888888889 | 0 |
| 0.8833333333333333 | 0 |
| 0.8840277777777777 | 0 |
| 0.8847222222222223 | 0 |
| 0.8854166666666666 | 0 |
| 0.8861111111111111 | 0 |
| 0.8868055555555556 | 0 |
| 0.8875000000000001 | 0 |
| 0.8881944444444444 | 0 |
| 0.8888888888888888 | 0 |
| 0.8895833333333334 | 0 |
| 0.8902777777777778 | 0 |
| 0.8909722222222222 | 0 |
| 0.8916666666666666 | 0 |
| 0.8923611111111112 | 0 |
| 0.8930555555555556 | 0 |
| 0.8937499999999999 | 0 |
| 0.8944444444444444 | 0 |
| 0.8951388888888889 | 0 |
| 0.8958333333333334 | 0 |
| 0.8965277777777777 | 0 |
| 0.8972222222222223 | 0 |
| 0.8979166666666667 | 0 |
| 0.8986111111111111 | 0 |
| 0.8993055555555555 | 0 |
| 0.9 | 0 |
| 0.9006944444444445 | 0 |
| 0.9013888888888889 | 0 |
| 0.9020833333333332 | 0 |
| 0.9027777777777778 | 0 |
| 0.9034722222222222 | 0 |
| 0.9041666666666667 | 0 |
| 0.904861111111111 | 0 |
| 0.9055555555555556 | 0 |
| 0.90625 | 0 |
| 0.9069444444444444 | 0 |
| 0.907638888888889 | 0 |
| 0.9083333333333333 | 0 |
| 0.9090277777777778 | 0 |
| 0.9097222222222222 | 0 |
| 0.9104166666666668 | 0 |
| 0.9111111111111111 | 0 |
| 0.9118055555555555 | 0 |
| 0.9125 | 0 |
| 0.9131944444444445 | 0 |
| 0.9138888888888889 | 0 |
| 0.9145833333333333 | 0 |
| 0.9152777777777777 | 0 |
| 0.9159722222222223 | 0 |
| 0.9166666666666666 | 0 |
| 0.9173611111111111 | 0 |
| 0.9180555555555556 | 0 |
| 0.9187500000000001 | 0 |
| 0.9194444444444444 | 0 |
| 0.9201388888888888 | 0 |
| 0.9208333333333334 | 0 |
| 0.9215277777777778 | 0 |
| 0.9222222222222222 | 0 |
| 0.9229166666666666 | 0 |
| 0.9236111111111112 | 0 |
| 0.9243055555555556 | 0 |
| 0.9249999999999999 | 0 |
| 0.9256944444444444 | 0 |
| 0.9263888888888889 | 0 |
| 0.9270833333333334 | 0 |
| 0.9277777777777777 | 0 |
| 0.9284722222222223 | 0 |
| 0.9291666666666667 | 0 |
| 0.9298611111111111 | 0 |
| 0.9305555555555555 | 0 |
| 0.93125 | 0 |
| 0.9319444444444445 | 0 |
| 0.9326388888888889 | 0 |
| 0.9333333333333332 | 0 |
| 0.9340277777777778 | 0 |
| 0.9347222222222222 | 0 |
| 0.9354166666666667 | 0 |
| 0.936111111111111 | 0 |
| 0.9368055555555556 | 0 |
| 0.9375 | 0 |
| 0.9381944444444444 | 0 |
| 0.938888888888889 | 0 |
| 0.9395833333333333 | 0 |
| 0.9402777777777778 | 0 |
| 0.9409722222222222 | 0 |
| 0.9416666666666668 | 0 |
| 0.9423611111111111 | 0 |
| 0.9430555555555555 | 0 |
| 0.94375 | 0 |
| 0.9444444444444445 | 0 |
| 0.9451388888888889 | 0 |
| 0.9458333333333333 | 0 |
| 0.9465277777777777 | 0 |
| 0.9472222222222223 | 0 |
| 0.9479166666666666 | 0 |
| 0.9486111111111111 | 0 |
| 0.9493055555555556 | 0 |
| 0.9500000000000001 | 0 |
| 0.9506944444444444 | 0 |
| 0.9513888888888888 | 0 |
| 0.9520833333333334 | 0 |
| 0.9527777777777778 | 0 |
| 0.9534722222222222 | 0 |
| 0.9541666666666666 | 0 |
| 0.9548611111111112 | 0 |
| 0.9555555555555556 | 0 |
| 0.9562499999999999 | 0 |
| 0.9569444444444444 | 0 |
| 0.9576388888888889 | 0 |
| 0.9583333333333334 | 0 |
| 0.9590277777777777 | 0 |
| 0.9597222222222223 | 0 |
| 0.9604166666666667 | 0 |
| 0.9611111111111111 | 0 |
| 0.9618055555555555 | 0 |
| 0.9625 | 0 |
| 0.9631944444444445 | 0 |
| 0.9638888888888889 | 0 |
| 0.9645833333333332 | 0 |
| 0.9652777777777778 | 0 |
| 0.9659722222222222 | 0 |
| 0.9666666666666667 | 0 |
| 0.967361111111111 | 0 |
| 0.9680555555555556 | 0 |
| 0.96875 | 0 |
| 0.9694444444444444 | 0 |
| 0.970138888888889 | 0 |
| 0.9708333333333333 | 0 |
| 0.9715277777777778 | 0 |
| 0.9722222222222222 | 0 |
| 0.9729166666666668 | 0 |
| 0.9736111111111111 | 0 |
| 0.9743055555555555 | 0 |
| 0.975 | 0 |
| 0.9756944444444445 | 0 |
| 0.9763888888888889 | 0 |
| 0.9770833333333333 | 0 |
| 0.9777777777777777 | 0 |
| 0.9784722222222223 | 0 |
| 0.9791666666666666 | 0 |
| 0.9798611111111111 | 0 |
| 0.9805555555555556 | 0 |
| 0.9812500000000001 | 0 |
| 0.9819444444444444 | 0 |
| 0.9826388888888888 | 0 |
| 0.9833333333333334 | 0 |
| 0.9840277777777778 | 0 |
| 0.9847222222222222 | 0 |
| 0.9854166666666666 | 0 |
| 0.9861111111111112 | 0 |
| 0.9868055555555556 | 0 |
| 0.9874999999999999 | 0 |
| 0.9881944444444444 | 0 |
| 0.9888888888888889 | 0 |
| 0.9895833333333334 | 0 |
| 0.9902777777777777 | 0 |
| 0.9909722222222223 | 0 |
| 0.9916666666666667 | 0 |
| 0.9923611111111111 | 0 |
| 0.9930555555555555 | 0 |
| 0.99375 | 0 |
| 0.9944444444444445 | 0 |
| 0.9951388888888889 | 0 |
| 0.9958333333333332 | 0 |
| 0.9965277777777778 | 0 |
| 0.9972222222222222 | 0 |
| 0.9979166666666667 | 0 |
| 0.998611111111111 | 0 |
| 0.9993055555555556 | 0 |